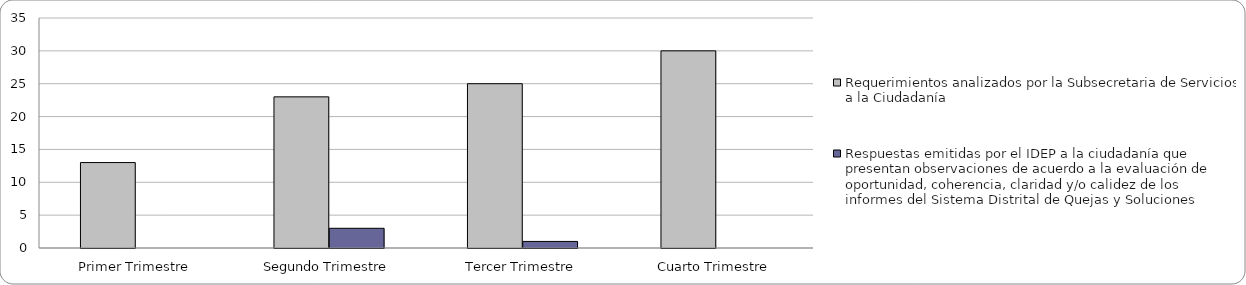
| Category | Requerimientos analizados por la Subsecretaria de Servicios a la Ciudadanía | Respuestas emitidas por el IDEP a la ciudadanía que presentan observaciones de acuerdo a la evaluación de oportunidad, coherencia, claridad y/o calidez de los informes del Sistema Distrital de Quejas y Soluciones  |
|---|---|---|
| Primer Trimestre | 13 | 0 |
| Segundo Trimestre | 23 | 3 |
| Tercer Trimestre | 25 | 1 |
| Cuarto Trimestre | 30 | 0 |